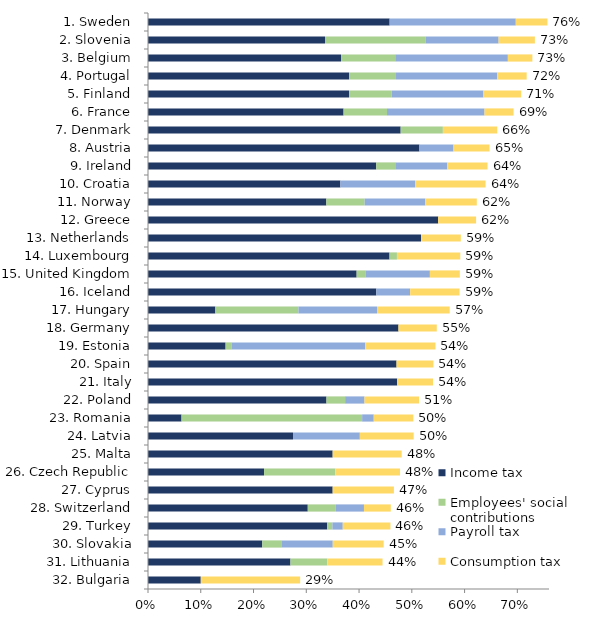
| Category | Income tax | Employees' social contributions | Payroll tax | Consumption tax | Effective marginal tax rate |
|---|---|---|---|---|---|
| 1. Sweden | 0.458 | 0 | 0.239 | 0.06 | 0.757 |
| 2. Slovenia | 0.335 | 0.19 | 0.139 | 0.069 | 0.733 |
| 3. Belgium | 0.366 | 0.103 | 0.213 | 0.046 | 0.729 |
| 4. Portugal | 0.381 | 0.089 | 0.192 | 0.056 | 0.718 |
| 5. Finland | 0.381 | 0.081 | 0.174 | 0.072 | 0.707 |
| 6. France | 0.371 | 0.082 | 0.185 | 0.055 | 0.693 |
| 7. Denmark | 0.479 | 0.08 | 0 | 0.103 | 0.662 |
| 8. Austria | 0.514 | 0 | 0.065 | 0.068 | 0.647 |
| 9. Ireland | 0.433 | 0.036 | 0.099 | 0.076 | 0.643 |
| 10. Croatia | 0.365 | 0 | 0.142 | 0.133 | 0.64 |
| 11. Norway | 0.338 | 0.073 | 0.115 | 0.097 | 0.623 |
| 12. Greece | 0.55 | 0 | 0 | 0.072 | 0.622 |
| 13. Netherlands | 0.518 | 0 | 0 | 0.075 | 0.593 |
| 14. Luxembourg | 0.458 | 0.014 | 0 | 0.12 | 0.592 |
| 15. United Kingdom | 0.395 | 0.018 | 0.121 | 0.057 | 0.591 |
| 16. Iceland | 0.433 | 0 | 0.064 | 0.094 | 0.59 |
| 17. Hungary | 0.128 | 0.157 | 0.149 | 0.138 | 0.572 |
| 18. Germany | 0.475 | 0 | 0 | 0.073 | 0.547 |
| 19. Estonia | 0.147 | 0.012 | 0.253 | 0.133 | 0.545 |
| 20. Spain | 0.471 | 0 | 0 | 0.07 | 0.541 |
| 21. Italy | 0.472 | 0 | 0 | 0.068 | 0.54 |
| 22. Poland | 0.338 | 0.035 | 0.037 | 0.103 | 0.514 |
| 23. Romania | 0.064 | 0.342 | 0.022 | 0.075 | 0.503 |
| 24. Latvia | 0.275 | 0 | 0.127 | 0.102 | 0.504 |
| 25. Malta | 0.35 | 0 | 0 | 0.131 | 0.481 |
| 26. Czech Republic | 0.22 | 0.135 | 0 | 0.123 | 0.478 |
| 27. Cyprus | 0.35 | 0 | 0 | 0.116 | 0.466 |
| 28. Switzerland | 0.303 | 0.053 | 0.053 | 0.051 | 0.46 |
| 29. Turkey | 0.34 | 0.01 | 0.02 | 0.09 | 0.459 |
| 30. Slovakia | 0.217 | 0.036 | 0.097 | 0.096 | 0.447 |
| 31. Lithuania | 0.27 | 0.07 | 0 | 0.105 | 0.445 |
| 32. Bulgaria | 0.1 | 0 | 0 | 0.188 | 0.288 |